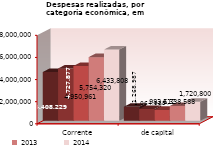
| Category | 2010 | 2011 | 2012 | 2013 | 2014 |
|---|---|---|---|---|---|
| Corrente | 4408229 | 4727877 | 4950961 | 5754320 | 6433808 |
| de capital | 1268987 | 1064935 | 983612 | 1338588 | 1720800 |